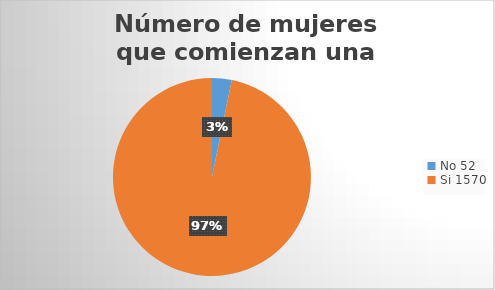
| Category | Número de mujeres que comienzan una carrera |
|---|---|
| 0 | 52 |
| 1 | 1570 |